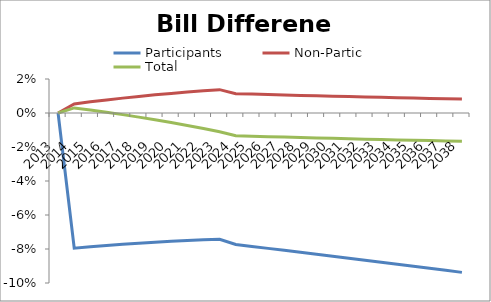
| Category | Participants | Non-Partic | Total |
|---|---|---|---|
| 2013.0 | 0 | 0 | 0 |
| 2014.0 | -0.08 | 0.005 | 0.003 |
| 2015.0 | -0.079 | 0.007 | 0.002 |
| 2016.0 | -0.078 | 0.008 | 0 |
| 2017.0 | -0.077 | 0.009 | -0.001 |
| 2018.0 | -0.077 | 0.01 | -0.002 |
| 2019.0 | -0.076 | 0.011 | -0.004 |
| 2020.0 | -0.075 | 0.012 | -0.006 |
| 2021.0 | -0.075 | 0.012 | -0.007 |
| 2022.0 | -0.075 | 0.013 | -0.009 |
| 2023.0 | -0.074 | 0.014 | -0.011 |
| 2024.0 | -0.077 | 0.011 | -0.013 |
| 2025.0 | -0.078 | 0.011 | -0.014 |
| 2026.0 | -0.08 | 0.011 | -0.014 |
| 2027.0 | -0.081 | 0.011 | -0.014 |
| 2028.0 | -0.082 | 0.01 | -0.014 |
| 2029.0 | -0.083 | 0.01 | -0.015 |
| 2030.0 | -0.084 | 0.01 | -0.015 |
| 2031.0 | -0.085 | 0.01 | -0.015 |
| 2032.0 | -0.087 | 0.009 | -0.015 |
| 2033.0 | -0.088 | 0.009 | -0.016 |
| 2034.0 | -0.089 | 0.009 | -0.016 |
| 2035.0 | -0.09 | 0.009 | -0.016 |
| 2036.0 | -0.091 | 0.009 | -0.016 |
| 2037.0 | -0.093 | 0.008 | -0.016 |
| 2038.0 | -0.094 | 0.008 | -0.017 |